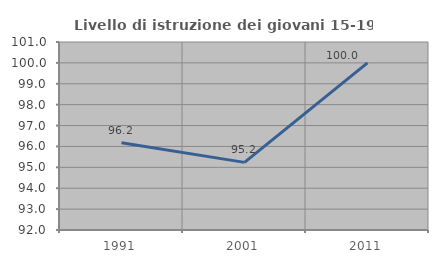
| Category | Livello di istruzione dei giovani 15-19 anni |
|---|---|
| 1991.0 | 96.178 |
| 2001.0 | 95.238 |
| 2011.0 | 100 |